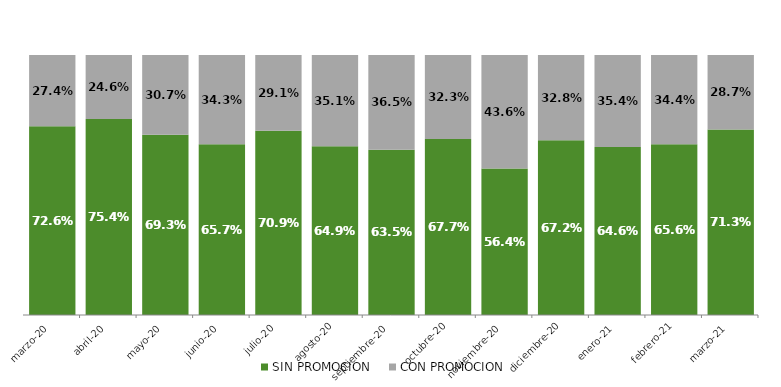
| Category | SIN PROMOCION   | CON PROMOCION   |
|---|---|---|
| 2020-03-01 | 0.726 | 0.274 |
| 2020-04-01 | 0.754 | 0.246 |
| 2020-05-01 | 0.693 | 0.307 |
| 2020-06-01 | 0.657 | 0.343 |
| 2020-07-01 | 0.709 | 0.291 |
| 2020-08-01 | 0.649 | 0.351 |
| 2020-09-01 | 0.635 | 0.365 |
| 2020-10-01 | 0.677 | 0.323 |
| 2020-11-01 | 0.564 | 0.436 |
| 2020-12-01 | 0.672 | 0.328 |
| 2021-01-01 | 0.646 | 0.354 |
| 2021-02-01 | 0.656 | 0.344 |
| 2021-03-01 | 0.713 | 0.287 |